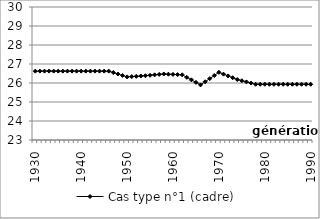
| Category | Cas type n°1 (cadre) |
|---|---|
| 1930.0 | 26.625 |
| 1931.0 | 26.625 |
| 1932.0 | 26.625 |
| 1933.0 | 26.625 |
| 1934.0 | 26.625 |
| 1935.0 | 26.625 |
| 1936.0 | 26.625 |
| 1937.0 | 26.625 |
| 1938.0 | 26.625 |
| 1939.0 | 26.625 |
| 1940.0 | 26.625 |
| 1941.0 | 26.625 |
| 1942.0 | 26.625 |
| 1943.0 | 26.625 |
| 1944.0 | 26.625 |
| 1945.0 | 26.625 |
| 1946.0 | 26.625 |
| 1947.0 | 26.549 |
| 1948.0 | 26.474 |
| 1949.0 | 26.398 |
| 1950.0 | 26.322 |
| 1951.0 | 26.338 |
| 1952.0 | 26.353 |
| 1953.0 | 26.368 |
| 1954.0 | 26.383 |
| 1955.0 | 26.406 |
| 1956.0 | 26.429 |
| 1957.0 | 26.452 |
| 1958.0 | 26.475 |
| 1959.0 | 26.464 |
| 1960.0 | 26.453 |
| 1961.0 | 26.442 |
| 1962.0 | 26.431 |
| 1963.0 | 26.298 |
| 1964.0 | 26.165 |
| 1965.0 | 26.033 |
| 1966.0 | 25.9 |
| 1967.0 | 26.065 |
| 1968.0 | 26.231 |
| 1969.0 | 26.396 |
| 1970.0 | 26.561 |
| 1971.0 | 26.467 |
| 1972.0 | 26.372 |
| 1973.0 | 26.278 |
| 1974.0 | 26.183 |
| 1975.0 | 26.121 |
| 1976.0 | 26.058 |
| 1977.0 | 25.996 |
| 1978.0 | 25.933 |
| 1979.0 | 25.933 |
| 1980.0 | 25.933 |
| 1981.0 | 25.933 |
| 1982.0 | 25.933 |
| 1983.0 | 25.933 |
| 1984.0 | 25.933 |
| 1985.0 | 25.933 |
| 1986.0 | 25.933 |
| 1987.0 | 25.933 |
| 1988.0 | 25.933 |
| 1989.0 | 25.933 |
| 1990.0 | 25.933 |